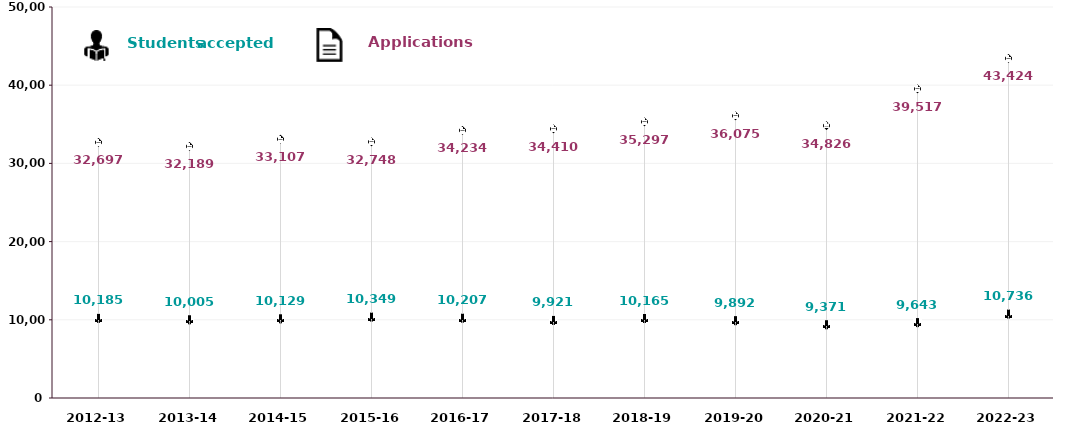
| Category | Applications | Students Accepted |
|---|---|---|
| 2012-13 | 32697 | 10185 |
| 2013-14 | 32189 | 10005 |
| 2014-15 | 33107 | 10129 |
| 2015-16 | 32748 | 10349 |
| 2016-17 | 34234 | 10207 |
| 2017-18 | 34410 | 9921 |
| 2018-19 | 35297 | 10165 |
| 2019-20 | 36075 | 9892 |
| 2020-21 | 34826 | 9371 |
| 2021-22 | 39517 | 9643 |
| 2022-23 | 43424 | 10736 |